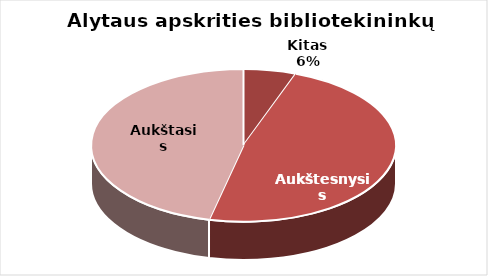
| Category | Series 0 |
|---|---|
| Kitas | 10 |
| Aukštesnysis | 86 |
| Aukštasis | 83 |